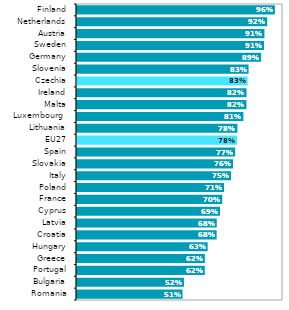
| Category | Series 1 |
|---|---|
| Romania | 0.512 |
| Bulgaria | 0.519 |
| Portugal | 0.62 |
| Greece | 0.621 |
| Hungary | 0.634 |
| Croatia | 0.678 |
| Latvia | 0.678 |
| Cyprus | 0.694 |
| France | 0.705 |
| Poland | 0.714 |
| Italy | 0.748 |
| Slovakia | 0.757 |
| Spain | 0.768 |
| EU27 | 0.777 |
| Lithuania | 0.779 |
| Luxembourg  | 0.808 |
| Malta | 0.823 |
| Ireland | 0.823 |
| Czechia | 0.828 |
| Slovenia | 0.833 |
| Germany | 0.894 |
| Sweden | 0.908 |
| Austria | 0.91 |
| Netherlands | 0.923 |
| Finland | 0.961 |